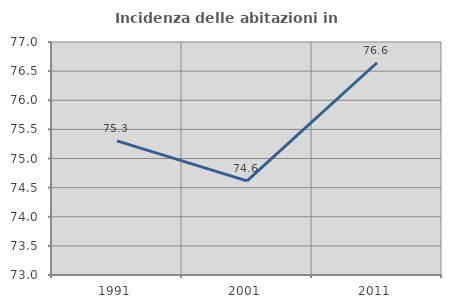
| Category | Incidenza delle abitazioni in proprietà  |
|---|---|
| 1991.0 | 75.303 |
| 2001.0 | 74.617 |
| 2011.0 | 76.644 |